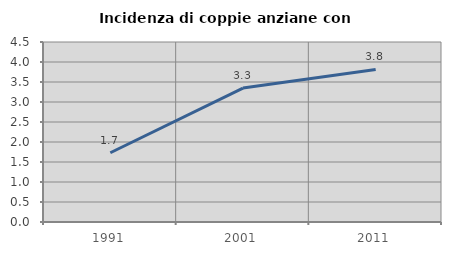
| Category | Incidenza di coppie anziane con figli |
|---|---|
| 1991.0 | 1.732 |
| 2001.0 | 3.349 |
| 2011.0 | 3.815 |